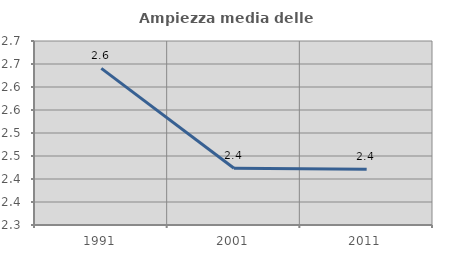
| Category | Ampiezza media delle famiglie |
|---|---|
| 1991.0 | 2.64 |
| 2001.0 | 2.423 |
| 2011.0 | 2.421 |